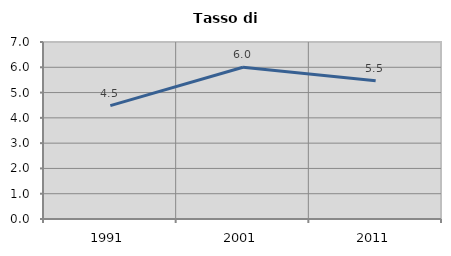
| Category | Tasso di disoccupazione   |
|---|---|
| 1991.0 | 4.484 |
| 2001.0 | 6 |
| 2011.0 | 5.47 |